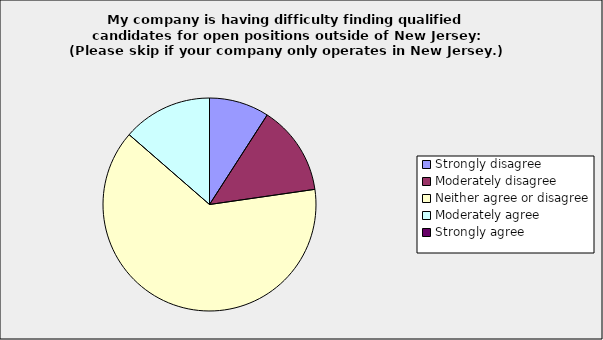
| Category | Series 0 |
|---|---|
| Strongly disagree | 0.091 |
| Moderately disagree | 0.136 |
| Neither agree or disagree | 0.636 |
| Moderately agree | 0.136 |
| Strongly agree | 0 |